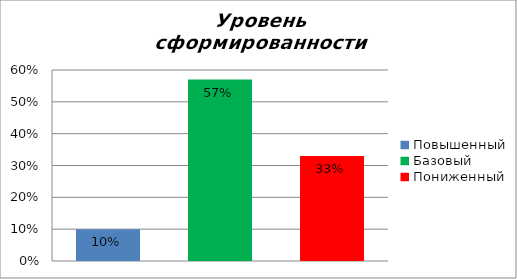
| Category | Уровень сформированности предметных результатов |
|---|---|
| Повышенный | 0.1 |
| Базовый | 0.57 |
| Пониженный | 0.33 |